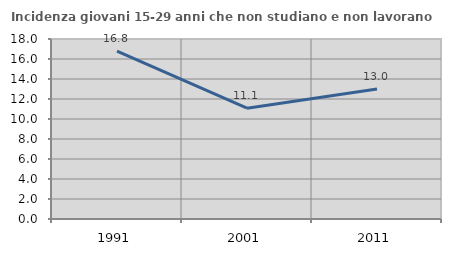
| Category | Incidenza giovani 15-29 anni che non studiano e non lavorano  |
|---|---|
| 1991.0 | 16.788 |
| 2001.0 | 11.076 |
| 2011.0 | 13 |